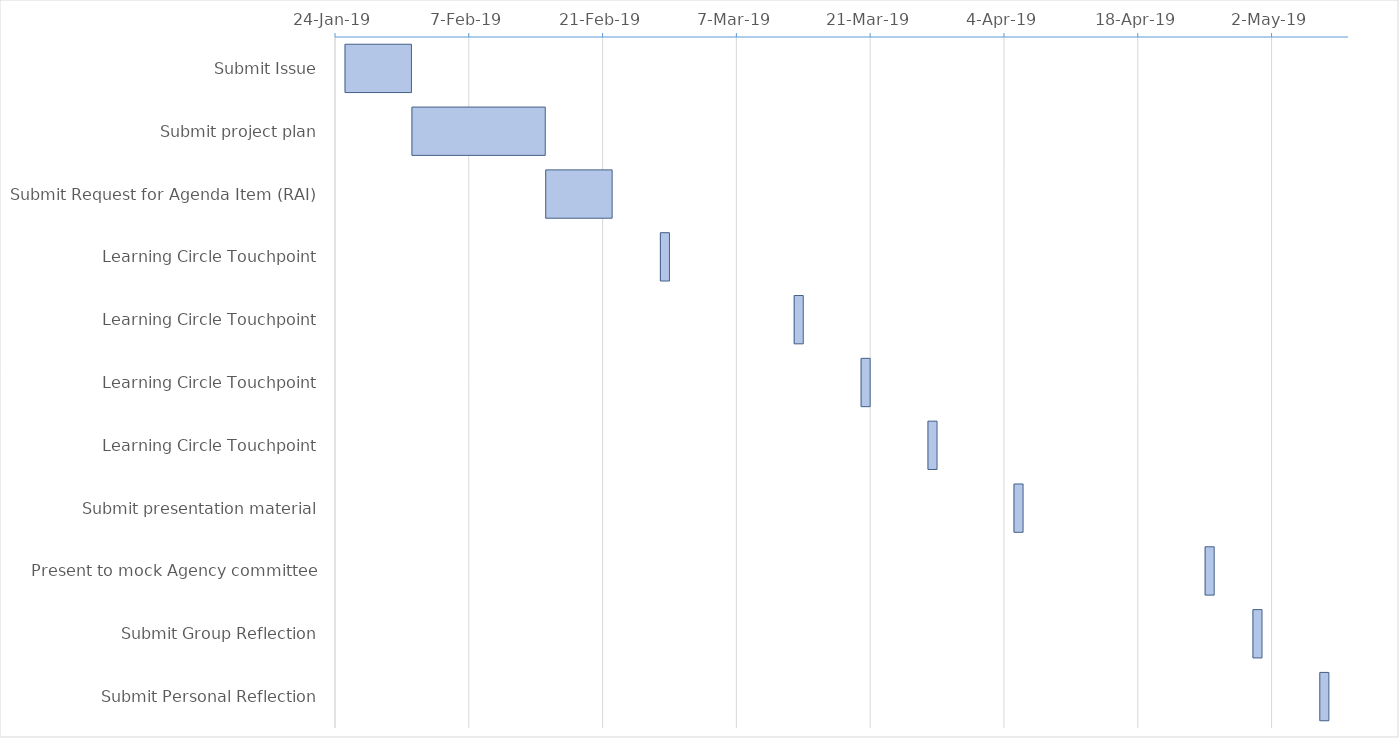
| Category | Start Date | Duration | Resource |
|---|---|---|---|
| Submit Issue | 2019-01-25 | 7 | 0 |
| Submit project plan | 2019-02-01 | 14 | 0 |
| Submit Request for Agenda Item (RAI) | 2019-02-15 | 7 | 0 |
| Learning Circle Touchpoint | 2019-02-27 | 1 | 0 |
| Learning Circle Touchpoint | 2019-03-13 | 1 | 0 |
| Learning Circle Touchpoint | 2019-03-20 | 1 | 0 |
| Learning Circle Touchpoint | 2019-03-27 | 1 | 0 |
| Submit presentation material | 2019-04-05 | 1 | 0 |
| Present to mock Agency committee | 2019-04-25 | 1 | 0 |
| Submit Group Reflection | 2019-04-30 | 1 | 0 |
| Submit Personal Reflection | 2019-05-07 | 1 | 0 |